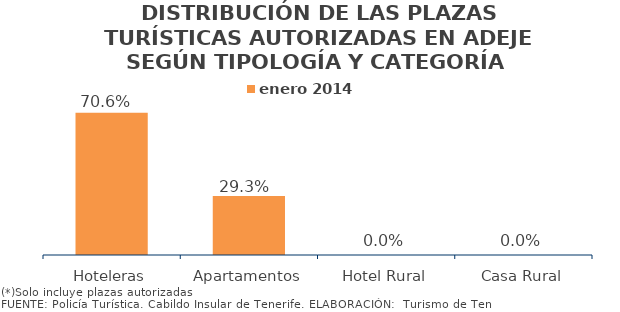
| Category | enero 2014 |
|---|---|
| Hoteleras | 0.706 |
| Apartamentos | 0.293 |
| Hotel Rural | 0 |
| Casa Rural | 0 |